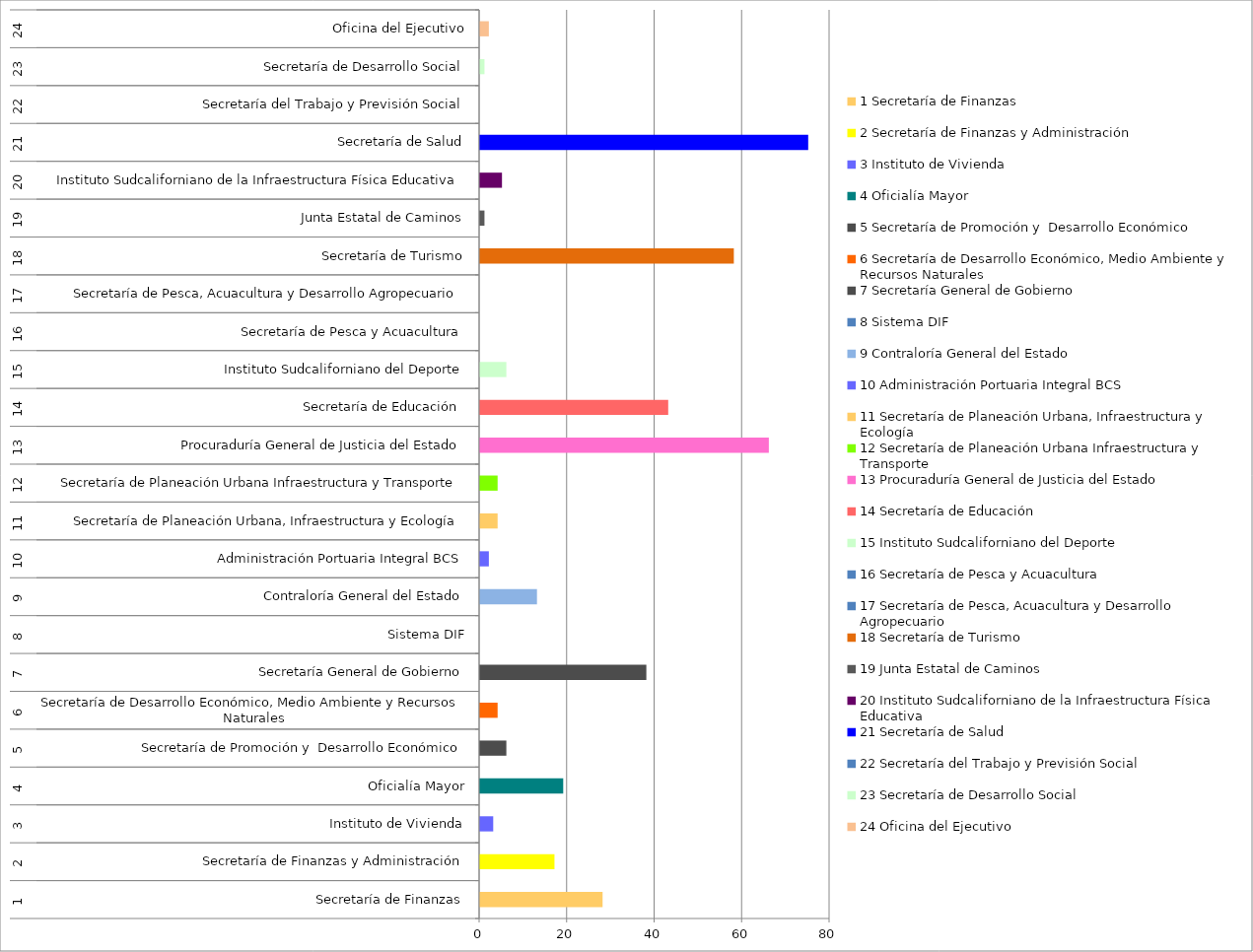
| Category | Series 0 |
|---|---|
| 0 | 28 |
| 1 | 17 |
| 2 | 3 |
| 3 | 19 |
| 4 | 6 |
| 5 | 4 |
| 6 | 38 |
| 7 | 0 |
| 8 | 13 |
| 9 | 2 |
| 10 | 4 |
| 11 | 4 |
| 12 | 66 |
| 13 | 43 |
| 14 | 6 |
| 15 | 0 |
| 16 | 0 |
| 17 | 58 |
| 18 | 1 |
| 19 | 5 |
| 20 | 75 |
| 21 | 0 |
| 22 | 1 |
| 23 | 2 |